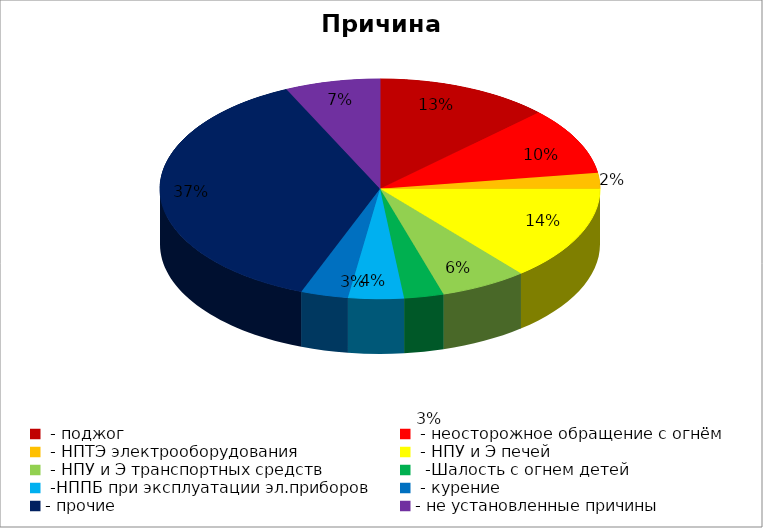
| Category | Причина пожара |
|---|---|
|  - поджог | 22 |
|  - неосторожное обращение с огнём | 17 |
|  - НПТЭ электрооборудования | 4 |
|  - НПУ и Э печей | 24 |
|  - НПУ и Э транспортных средств | 11 |
|   -Шалость с огнем детей | 5 |
|  -НППБ при эксплуатации эл.приборов | 7 |
|  - курение | 6 |
| - прочие | 64 |
| - не установленные причины | 12 |